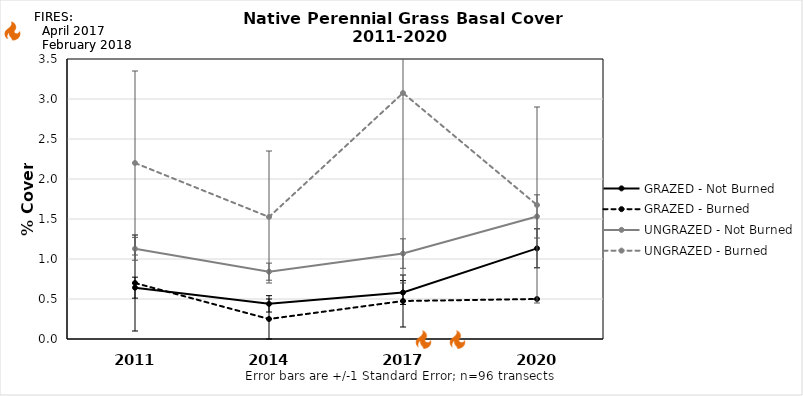
| Category | GRAZED - Not Burned | GRAZED - Burned | UNGRAZED - Not Burned | UNGRAZED - Burned |
|---|---|---|---|---|
| 2011.0 | 0.642 | 0.7 | 1.127 | 2.2 |
| 2014.0 | 0.439 | 0.25 | 0.842 | 1.525 |
| 2017.0 | 0.581 | 0.475 | 1.068 | 3.075 |
| 2020.0 | 1.133 | 0.5 | 1.532 | 1.675 |